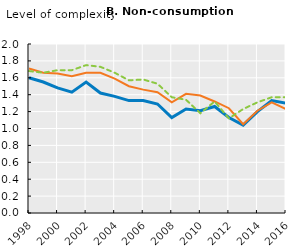
| Category | Africa | Asia | LAC |
|---|---|---|---|
| 1998.0 | 1.6 | 1.71 | 1.68 |
| 1999.0 | 1.55 | 1.66 | 1.66 |
| 2000.0 | 1.48 | 1.65 | 1.69 |
| 2001.0 | 1.43 | 1.62 | 1.69 |
| 2002.0 | 1.55 | 1.66 | 1.75 |
| 2003.0 | 1.42 | 1.66 | 1.73 |
| 2004.0 | 1.38 | 1.59 | 1.66 |
| 2005.0 | 1.33 | 1.5 | 1.57 |
| 2006.0 | 1.33 | 1.46 | 1.58 |
| 2007.0 | 1.29 | 1.43 | 1.53 |
| 2008.0 | 1.13 | 1.31 | 1.37 |
| 2009.0 | 1.23 | 1.41 | 1.34 |
| 2010.0 | 1.21 | 1.39 | 1.18 |
| 2011.0 | 1.26 | 1.32 | 1.32 |
| 2012.0 | 1.13 | 1.24 | 1.12 |
| 2013.0 | 1.04 | 1.05 | 1.23 |
| 2014.0 | 1.2 | 1.21 | 1.31 |
| 2015.0 | 1.33 | 1.31 | 1.37 |
| 2016.0 | 1.3 | 1.23 | 1.37 |